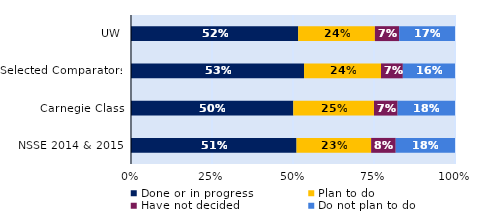
| Category | Done or in progress | Plan to do | Have not decided | Do not plan to do |
|---|---|---|---|---|
| UW | 0.516 | 0.237 | 0.075 | 0.172 |
| Selected Comparators | 0.534 | 0.237 | 0.067 | 0.161 |
| Carnegie Class | 0.501 | 0.249 | 0.073 | 0.177 |
| NSSE 2014 & 2015 | 0.511 | 0.23 | 0.076 | 0.183 |